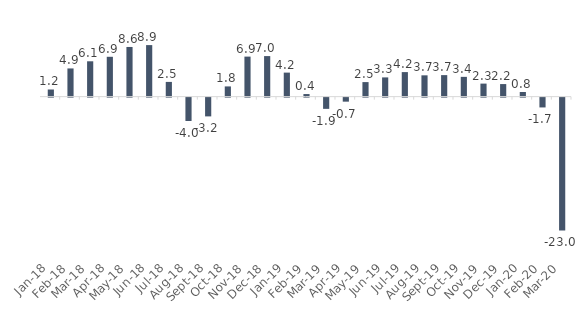
| Category | SAAR |
|---|---|
| 2018-01-01 | 1.234 |
| 2018-02-01 | 4.881 |
| 2018-03-01 | 6.119 |
| 2018-04-01 | 6.898 |
| 2018-05-01 | 8.599 |
| 2018-06-01 | 8.922 |
| 2018-07-01 | 2.548 |
| 2018-08-01 | -4.043 |
| 2018-09-01 | -3.249 |
| 2018-10-01 | 1.767 |
| 2018-11-01 | 6.929 |
| 2018-12-01 | 7.02 |
| 2019-01-01 | 4.158 |
| 2019-02-01 | 0.446 |
| 2019-03-01 | -1.945 |
| 2019-04-01 | -0.698 |
| 2019-05-01 | 2.516 |
| 2019-06-01 | 3.328 |
| 2019-07-01 | 4.247 |
| 2019-08-01 | 3.687 |
| 2019-09-01 | 3.724 |
| 2019-10-01 | 3.423 |
| 2019-11-01 | 2.255 |
| 2019-12-01 | 2.175 |
| 2020-01-01 | 0.8 |
| 2020-02-01 | -1.7 |
| 2020-03-01 | -23 |